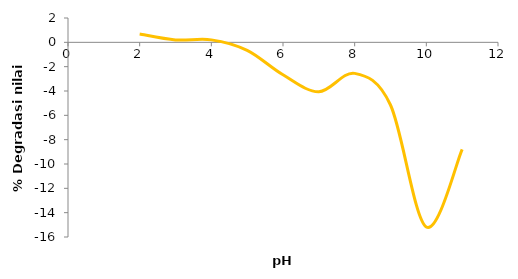
| Category | L |
|---|---|
| 2.0 | 0.686 |
| 3.0 | 0.197 |
| 4.0 | 0.202 |
| 5.0 | -0.661 |
| 6.0 | -2.67 |
| 7.0 | -4.062 |
| 8.0 | -2.549 |
| 9.0 | -5.151 |
| 10.0 | -15.177 |
| 11.0 | -8.792 |